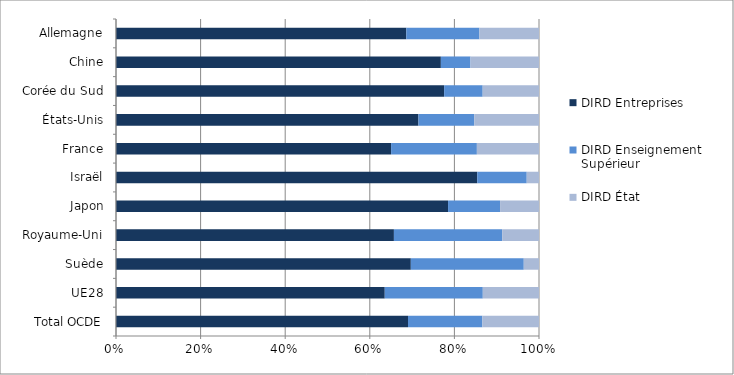
| Category | DIRD Entreprises | DIRD Enseignement Supérieur | DIRD État |
|---|---|---|---|
| Total OCDE | 69.1 | 17.6 | 13.4 |
| UE28 | 63.6 | 23.2 | 13.3 |
| Suède | 69.7 | 26.7 | 3.6 |
| Royaume-Uni | 65.7 | 25.6 | 8.7 |
| Japon | 78.5 | 12.3 | 9.2 |
| Israël | 85.4 | 11.7 | 2.9 |
| France | 65.1 | 20.3 | 14.7 |
| États-Unis | 71.5 | 13.2 | 15.3 |
| Corée du Sud | 77.5 | 9.1 | 13.3 |
| Chine | 76.8 | 7 | 16.2 |
| Allemagne | 68.7 | 17.3 | 14.1 |